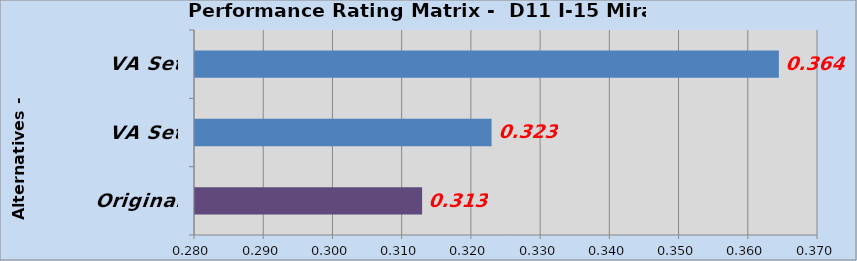
| Category | Original VA Set 1 VA Set 2 |
|---|---|
| Original | 0.313 |
| VA Set 1 | 0.323 |
| VA Set 2 | 0.364 |